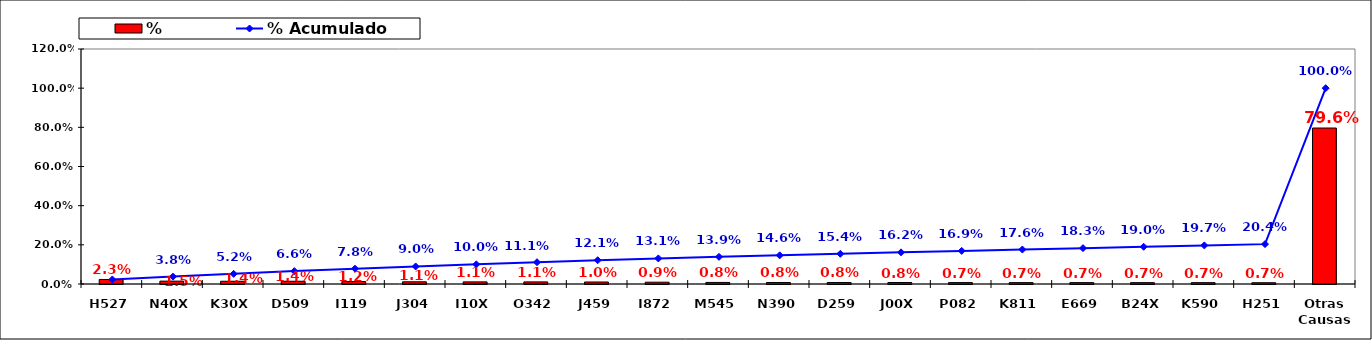
| Category | % |
|---|---|
| H527 | 0.023 |
| N40X | 0.015 |
| K30X | 0.014 |
| D509 | 0.014 |
| I119 | 0.012 |
| J304 | 0.011 |
| I10X | 0.011 |
| O342 | 0.011 |
| J459 | 0.01 |
| I872 | 0.009 |
| M545 | 0.008 |
| N390 | 0.008 |
| D259 | 0.008 |
| J00X | 0.008 |
| P082 | 0.007 |
| K811 | 0.007 |
| E669 | 0.007 |
| B24X | 0.007 |
| K590 | 0.007 |
| H251 | 0.007 |
| Otras Causas | 0.796 |